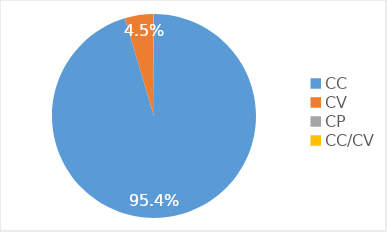
| Category | Доля, % |
|---|---|
| CC | 0.954 |
| CV | 0.045 |
| CP | 0 |
| CC/CV | 0 |